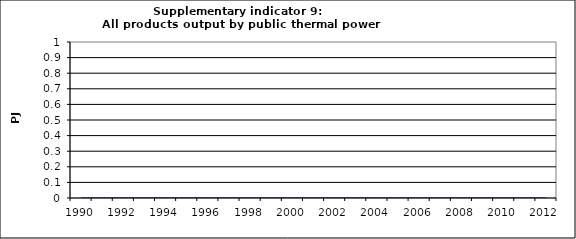
| Category | All products output by public thermal power stations, PJ |
|---|---|
| 1990 | 0 |
| 1991 | 0 |
| 1992 | 0 |
| 1993 | 0 |
| 1994 | 0 |
| 1995 | 0 |
| 1996 | 0 |
| 1997 | 0 |
| 1998 | 0 |
| 1999 | 0 |
| 2000 | 0 |
| 2001 | 0 |
| 2002 | 0 |
| 2003 | 0 |
| 2004 | 0 |
| 2005 | 0 |
| 2006 | 0 |
| 2007 | 0 |
| 2008 | 0 |
| 2009 | 0 |
| 2010 | 0 |
| 2011 | 0 |
| 2012 | 0 |